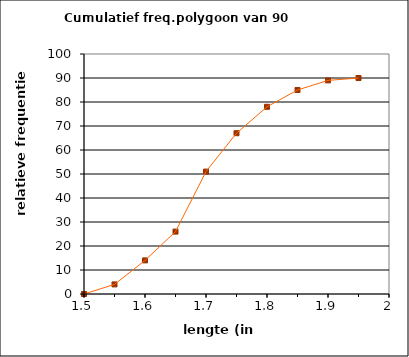
| Category | Series 0 |
|---|---|
| 1.5 | 0 |
| 1.55 | 4 |
| 1.6 | 14 |
| 1.65 | 26 |
| 1.7 | 51 |
| 1.75 | 67 |
| 1.8 | 78 |
| 1.85 | 85 |
| 1.9 | 89 |
| 1.95 | 90 |